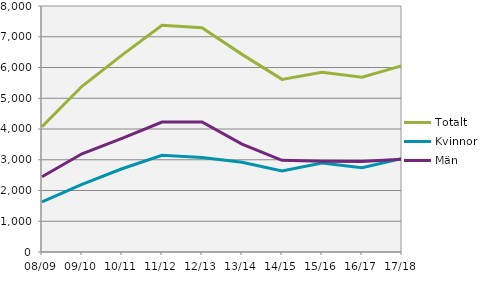
| Category | Totalt | Kvinnor | Män |
|---|---|---|---|
| 08/09 | 4077 | 1632 | 2445 |
| 09/10 | 5390 | 2197 | 3193 |
| 10/11 | 6403 | 2708 | 3695 |
| 11/12 | 7370 | 3143 | 4227 |
| 12/13 | 7296 | 3070 | 4226 |
| 13/14 | 6427 | 2916 | 3511 |
| 14/15 | 5614 | 2633 | 2981 |
| 15/16 | 5843 | 2895 | 2948 |
| 16/17 | 5684 | 2744 | 2940 |
| 17/18 | 6060 | 3042 | 3018 |